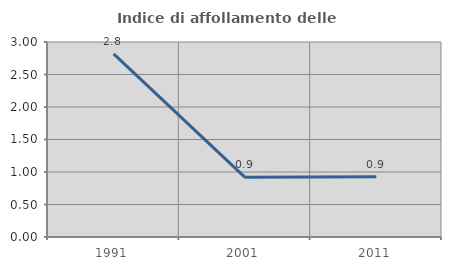
| Category | Indice di affollamento delle abitazioni  |
|---|---|
| 1991.0 | 2.817 |
| 2001.0 | 0.917 |
| 2011.0 | 0.926 |